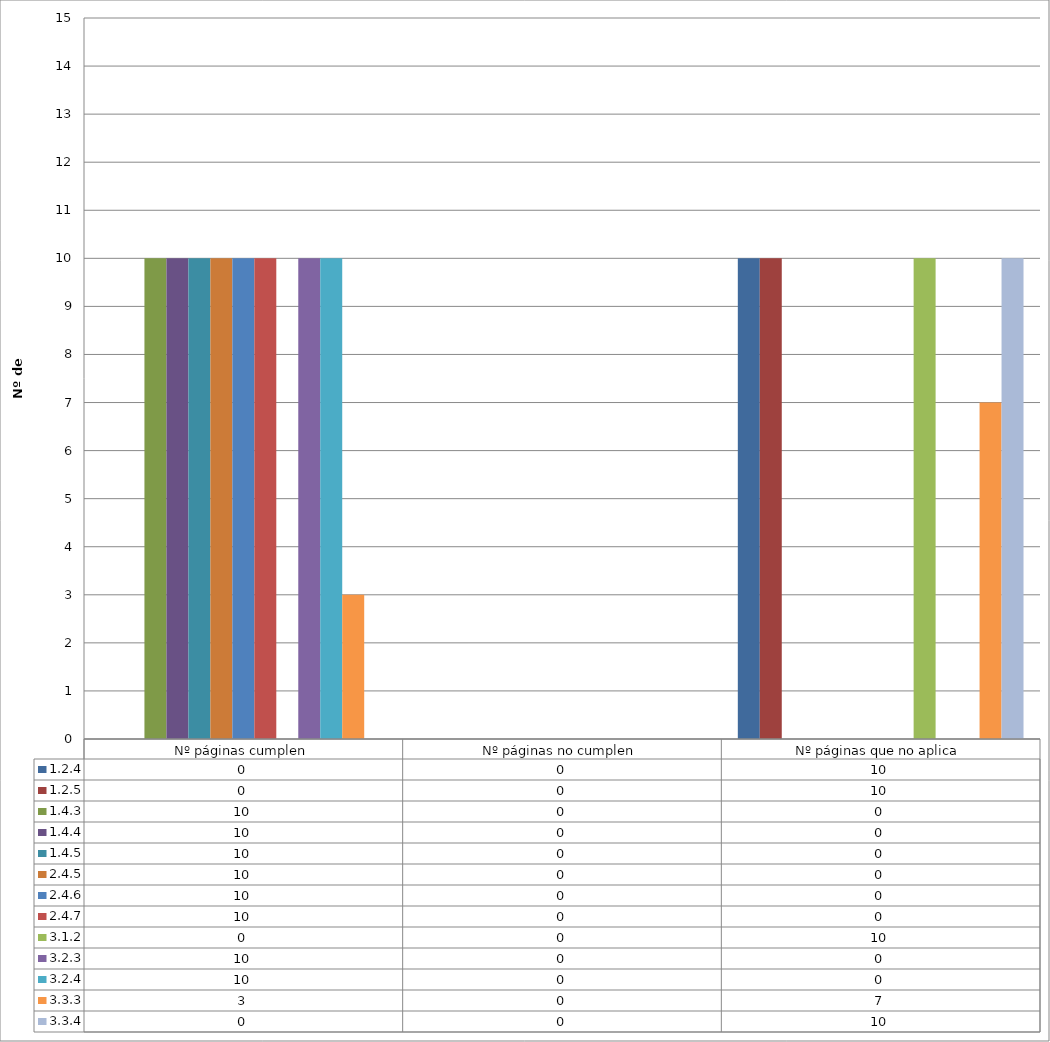
| Category | 1.2.4 | 1.2.5 | 1.4.3 | 1.4.4 | 1.4.5 | 2.4.5 | 2.4.6 | 2.4.7 | 3.1.2 | 3.2.3 | 3.2.4 | 3.3.3 | 3.3.4 |
|---|---|---|---|---|---|---|---|---|---|---|---|---|---|
| 0 | 0 | 0 | 10 | 10 | 10 | 10 | 10 | 10 | 0 | 10 | 10 | 3 | 0 |
| 1 | 0 | 0 | 0 | 0 | 0 | 0 | 0 | 0 | 0 | 0 | 0 | 0 | 0 |
| 2 | 10 | 10 | 0 | 0 | 0 | 0 | 0 | 0 | 10 | 0 | 0 | 7 | 10 |